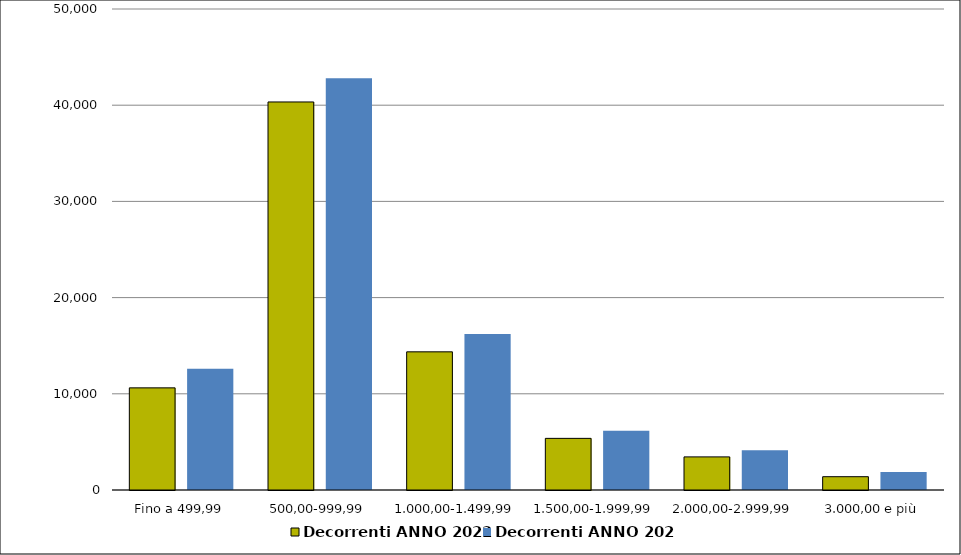
| Category | Decorrenti ANNO 2022 | Decorrenti ANNO 2021 |
|---|---|---|
|  Fino a 499,99  | 10617 | 12597 |
|  500,00-999,99  | 40336 | 42798 |
|  1.000,00-1.499,99  | 14362 | 16214 |
|  1.500,00-1.999,99  | 5367 | 6153 |
|  2.000,00-2.999,99  | 3443 | 4139 |
|  3.000,00 e più  | 1383 | 1878 |